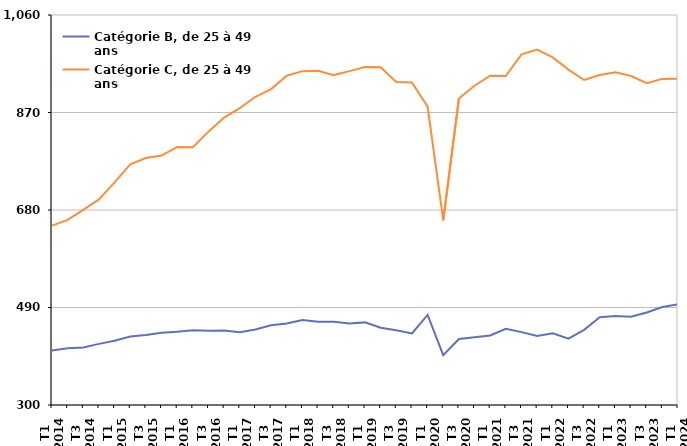
| Category | Catégorie B, de 25 à 49 ans | Catégorie C, de 25 à 49 ans |
|---|---|---|
| T1
2014 | 406.1 | 649.5 |
| T2
2014 | 410.5 | 660.6 |
| T3
2014 | 412.2 | 680.3 |
| T4
2014 | 419.1 | 700.6 |
| T1
2015 | 425.1 | 733.9 |
| T2
2015 | 433.5 | 769.1 |
| T3
2015 | 436.2 | 781.2 |
| T4
2015 | 440.9 | 786 |
| T1
2016 | 442.7 | 802.8 |
| T2
2016 | 445.7 | 802.3 |
| T3
2016 | 444.7 | 832.7 |
| T4
2016 | 445.1 | 860.1 |
| T1
2017 | 441.8 | 878.5 |
| T2
2017 | 447 | 900.7 |
| T3
2017 | 455.4 | 915.7 |
| T4
2017 | 458.9 | 941.6 |
| T1
2018 | 465.4 | 950.6 |
| T2
2018 | 462.1 | 951.5 |
| T3
2018 | 462.4 | 942.9 |
| T4
2018 | 458.9 | 950.6 |
| T1
2019 | 461 | 958.8 |
| T2
2019 | 450.5 | 958.3 |
| T3
2019 | 445.5 | 929.4 |
| T4
2019 | 439.3 | 928.5 |
| T1
2020 | 475.6 | 881.5 |
| T2
2020 | 397.2 | 659.9 |
| T3
2020 | 428.5 | 897.2 |
| T4
2020 | 432.2 | 922.2 |
| T1
2021 | 435.5 | 941.6 |
| T2
2021 | 448.6 | 941.2 |
| T3
2021 | 442 | 983.2 |
| T4
2021 | 434.5 | 992.6 |
| T1
2022 | 439.9 | 977.3 |
| T2
2022 | 429.2 | 953.6 |
| T3
2022 | 446.5 | 933.4 |
| T4
2022 | 470.9 | 942.9 |
| T1
2023 | 473.3 | 948.6 |
| T2
2023 | 472.1 | 941 |
| T3
2023 | 480.3 | 927.3 |
| T4
2023 | 491.1 | 935.5 |
| T1
2024 | 496.2 | 935.8 |